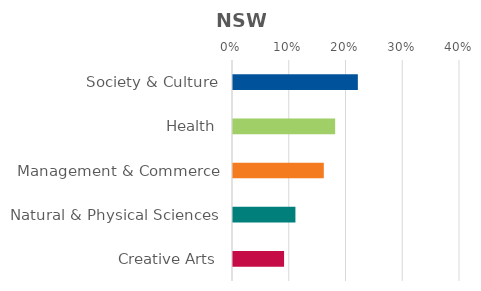
| Category | Series 0 |
|---|---|
| Society & Culture | 0.22 |
| Health | 0.18 |
| Management & Commerce | 0.16 |
| Natural & Physical Sciences | 0.11 |
| Creative Arts | 0.09 |